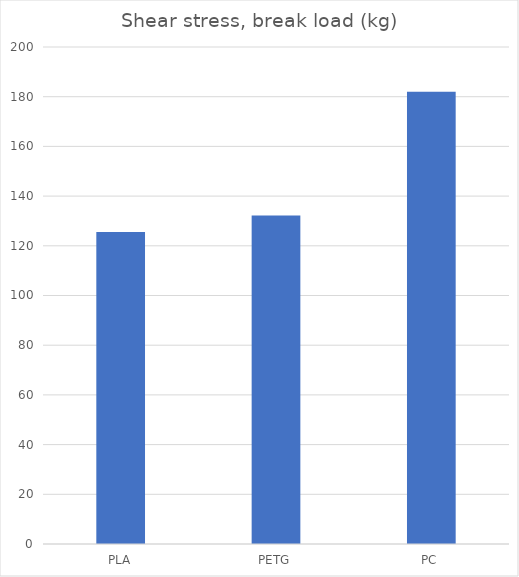
| Category | Break kg |
|---|---|
| PLA | 125.6 |
| PETG | 132.2 |
| PC | 182 |